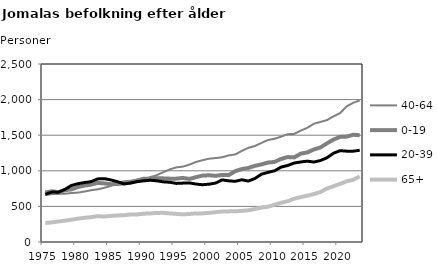
| Category | 40-64 | 0-19 | 20-39 | 65+ |
|---|---|---|---|---|
| 1975.0 | 658 | 697 | 670 | 267 |
| 1976.0 | 673 | 712 | 701 | 275 |
| 1977.0 | 675 | 700 | 700 | 288 |
| 1978.0 | 678 | 727 | 739 | 300 |
| 1979.0 | 688 | 739 | 794 | 313 |
| 1980.0 | 694 | 773 | 819 | 329 |
| 1981.0 | 709 | 792 | 835 | 340 |
| 1982.0 | 727 | 806 | 848 | 349 |
| 1983.0 | 740 | 830 | 886 | 363 |
| 1984.0 | 761 | 823 | 890 | 357 |
| 1985.0 | 788 | 812 | 872 | 367 |
| 1986.0 | 823 | 814 | 848 | 373 |
| 1987.0 | 853 | 824 | 816 | 376 |
| 1988.0 | 860 | 838 | 827 | 387 |
| 1989.0 | 874 | 863 | 847 | 387 |
| 1990.0 | 881 | 888 | 859 | 397 |
| 1991.0 | 911 | 890 | 867 | 401 |
| 1992.0 | 938 | 896 | 860 | 408 |
| 1993.0 | 980 | 894 | 845 | 410 |
| 1994.0 | 1020 | 890 | 839 | 401 |
| 1995.0 | 1048 | 890 | 823 | 395 |
| 1996.0 | 1059 | 900 | 827 | 389 |
| 1997.0 | 1086 | 886 | 830 | 393 |
| 1998.0 | 1124 | 910 | 814 | 402 |
| 1999.0 | 1149 | 933 | 804 | 402 |
| 2000.0 | 1170 | 937 | 812 | 409 |
| 2001.0 | 1179 | 930 | 828 | 419 |
| 2002.0 | 1190 | 942 | 872 | 429 |
| 2003.0 | 1216 | 939 | 859 | 430 |
| 2004.0 | 1230 | 995 | 852 | 431 |
| 2005.0 | 1279 | 1024 | 874 | 437 |
| 2006.0 | 1323 | 1040 | 856 | 445 |
| 2007.0 | 1348 | 1070 | 892 | 464 |
| 2008.0 | 1392 | 1090 | 952 | 483 |
| 2009.0 | 1433 | 1116 | 978 | 495 |
| 2010.0 | 1450 | 1125 | 1000 | 523 |
| 2011.0 | 1479 | 1167 | 1052 | 551 |
| 2012.0 | 1514 | 1193 | 1075 | 573 |
| 2013.0 | 1519 | 1188 | 1109 | 608 |
| 2014.0 | 1564 | 1241 | 1124 | 631 |
| 2015.0 | 1604 | 1258 | 1136 | 650 |
| 2016.0 | 1661 | 1300 | 1123 | 673 |
| 2017.0 | 1686 | 1327 | 1144 | 702 |
| 2018.0 | 1712 | 1386 | 1183 | 751 |
| 2019.0 | 1764 | 1439 | 1247 | 783 |
| 2020.0 | 1811 | 1476 | 1283 | 816 |
| 2021.0 | 1904 | 1480 | 1276 | 852 |
| 2022.0 | 1955 | 1506 | 1276 | 873 |
| 2023.0 | 1989 | 1499 | 1288 | 921 |